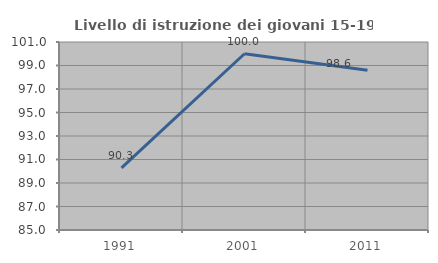
| Category | Livello di istruzione dei giovani 15-19 anni |
|---|---|
| 1991.0 | 90.291 |
| 2001.0 | 100 |
| 2011.0 | 98.592 |